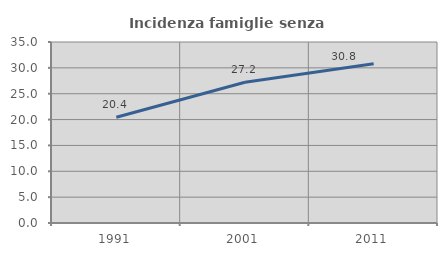
| Category | Incidenza famiglie senza nuclei |
|---|---|
| 1991.0 | 20.443 |
| 2001.0 | 27.211 |
| 2011.0 | 30.813 |